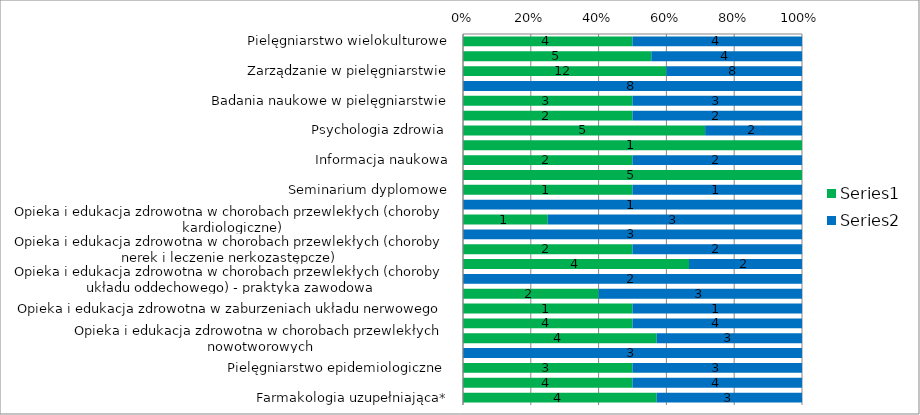
| Category | Series 0 | Series 1 |
|---|---|---|
| Pielęgniarstwo wielokulturowe | 4 | 4 |
| Prawo w praktyce pielęgniarskiej | 5 | 4 |
| Zarządzanie w pielęgniarstwie | 12 | 8 |
| Zarządzanie w pielęgniarstwie - praktyka zawodowa | 0 | 8 |
| Badania naukowe w pielęgniarstwie | 3 | 3 |
| Statystyka medyczna | 2 | 2 |
| Psychologia zdrowia  | 5 | 2 |
| Praktyka pielęgniarska oparta na dowodach naukowych  | 1 | 0 |
| Informacja naukowa | 2 | 2 |
| Pielęgniarstwo w perspektywie międzynarodowej | 5 | 0 |
| Seminarium dyplomowe | 1 | 1 |
| Język angielski | 0 | 1 |
| Opieka i edukacja zdrowotna w chorobach przewlekłych (choroby kardiologiczne) | 1 | 3 |
| Opieka i edukacja zdrowotna w chorobach przewlekłych (choroby kardiologiczne) - praktyka zawodowa | 0 | 3 |
| Opieka i edukacja zdrowotna w chorobach przewlekłych (choroby nerek i leczenie nerkozastępcze)  | 2 | 2 |
| Opieka i edukacja zdrowotna w chorobach przewlekłych (choroby układu oddechowego) | 4 | 2 |
| Opieka i edukacja zdrowotna w chorobach przewlekłych (choroby układu oddechowego) - praktyka zawodowa | 0 | 2 |
| Opieka i edukacja zdrowotna (diabetologia) | 2 | 3 |
| Opieka i edukacja zdrowotna w zaburzeniach układu nerwowego | 1 | 1 |
| Opieka i edukacja zdrowotna w zaburzeniach zdrowia psychicznego | 4 | 4 |
| Opieka i edukacja zdrowotna w chorobach przewlekłych  nowotworowych  | 4 | 3 |
| Opieka i edukacja zdrowotna w chorobach przewlekłych  nowotworowych - praktyka zawodowa | 0 | 3 |
| Pielęgniarstwo epidemiologiczne  | 3 | 3 |
| Farmakologia i ordynowanie produktów leczniczych | 4 | 4 |
| Farmakologia uzupełniająca* | 4 | 3 |